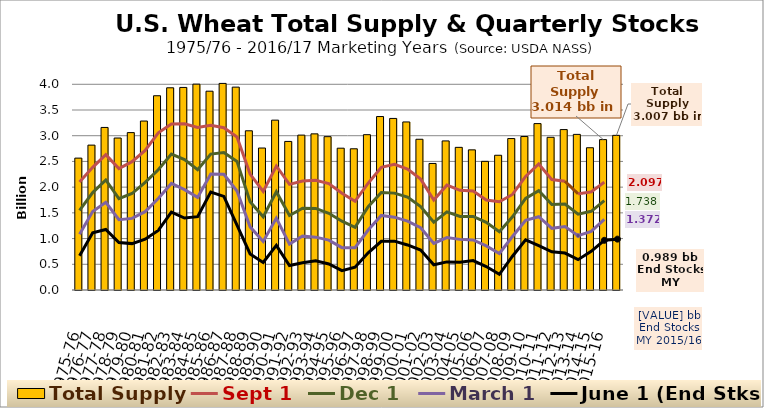
| Category | Total Supply |
|---|---|
| 1975-76 | 2.564 |
| 1976-77 | 2.817 |
| 1977-78 | 3.161 |
| 1978-79 | 2.955 |
| 1979-80 | 3.06 |
| 1980-81 | 3.285 |
| 1981-82 | 3.777 |
| 1982-83 | 3.932 |
| 1983-84 | 3.939 |
| 1984-85 | 4.003 |
| 1985-86 | 3.866 |
| 1986-87 | 4.017 |
| 1987-88 | 3.945 |
| 1988-89 | 3.096 |
| 1989-90 | 2.761 |
| 1990-91 | 3.303 |
| 1991-92 | 2.889 |
| 1992-93 | 3.012 |
| 1993-94 | 3.036 |
| 1994-95 | 2.981 |
| 1995-96 | 2.757 |
| 1996-97 | 2.746 |
| 1997-98 | 3.02 |
| 1998-99 | 3.373 |
| 1999-00 | 3.336 |
| 2000-01 | 3.268 |
| 2001-02 | 2.931 |
| 2002-03 | 2.46 |
| 2003-04 | 2.899 |
| 2004-05 | 2.774 |
| 2005-06 | 2.725 |
| 2006-07 | 2.501 |
| 2007-08 | 2.62 |
| 2008-09 | 2.945 |
| 2009-10 | 2.984 |
| 2010-11 | 3.236 |
| 2011-12 | 2.969 |
| 2012-13 | 3.119 |
| 2013-14 | 3.026 |
| 2014-15 | 2.766 |
| 2015-16 | 2.924 |